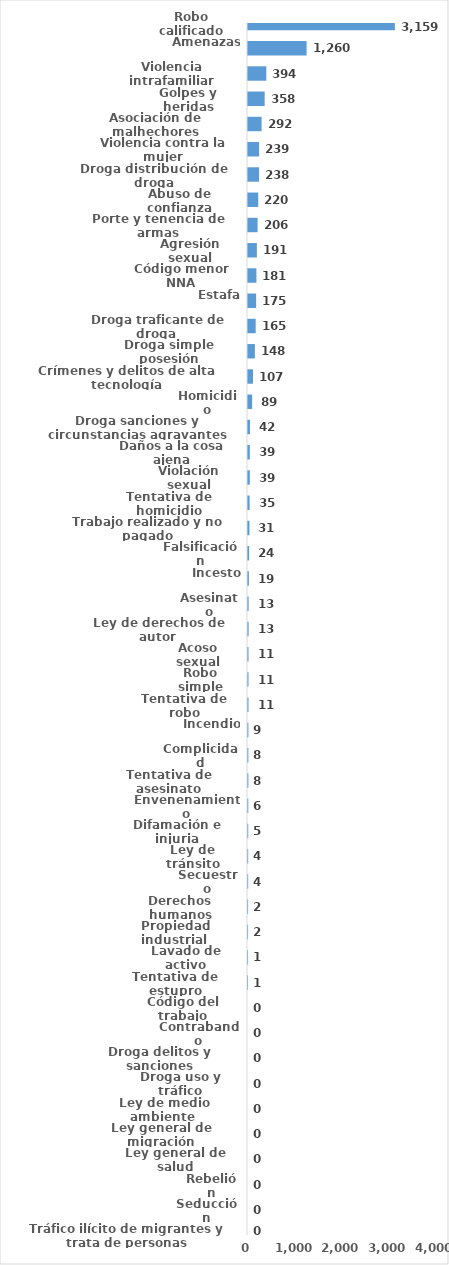
| Category | Series 0 |
|---|---|
| Robo calificado | 3159 |
| Amenazas | 1260 |
| Violencia intrafamiliar | 394 |
| Golpes y heridas | 358 |
| Asociación de malhechores | 292 |
| Violencia contra la mujer | 239 |
| Droga distribución de droga | 238 |
| Abuso de confianza | 220 |
| Porte y tenencia de armas | 206 |
| Agresión sexual | 191 |
| Código menor NNA | 181 |
| Estafa | 175 |
| Droga traficante de droga  | 165 |
| Droga simple posesión | 148 |
| Crímenes y delitos de alta tecnología | 107 |
| Homicidio | 89 |
| Droga sanciones y circunstancias agravantes | 42 |
| Daños a la cosa ajena | 39 |
| Violación sexual | 39 |
| Tentativa de homicidio | 35 |
| Trabajo realizado y no pagado | 31 |
| Falsificación | 24 |
| Incesto | 19 |
| Asesinato | 13 |
| Ley de derechos de autor  | 13 |
| Acoso sexual | 11 |
| Robo simple | 11 |
| Tentativa de robo | 11 |
| Incendio | 9 |
| Complicidad | 8 |
| Tentativa de asesinato | 8 |
| Envenenamiento | 6 |
| Difamación e injuria | 5 |
| Ley de tránsito | 4 |
| Secuestro | 4 |
| Derechos humanos | 2 |
| Propiedad industrial  | 2 |
| Lavado de activo | 1 |
| Tentativa de estupro | 1 |
| Código del trabajo | 0 |
| Contrabando | 0 |
| Droga delitos y sanciones | 0 |
| Droga uso y tráfico | 0 |
| Ley de medio ambiente  | 0 |
| Ley general de migración | 0 |
| Ley general de salud | 0 |
| Rebelión | 0 |
| Seducción | 0 |
| Tráfico ilícito de migrantes y trata de personas | 0 |